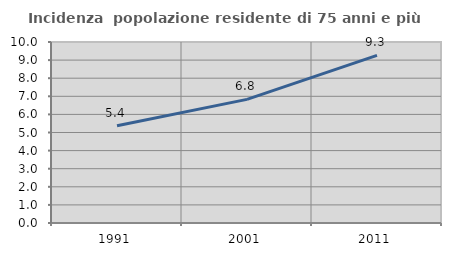
| Category | Incidenza  popolazione residente di 75 anni e più |
|---|---|
| 1991.0 | 5.369 |
| 2001.0 | 6.83 |
| 2011.0 | 9.262 |